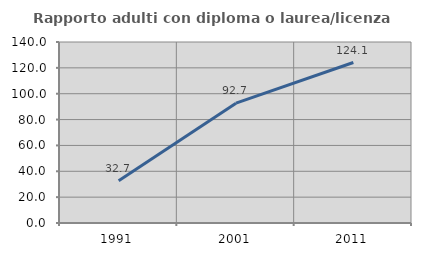
| Category | Rapporto adulti con diploma o laurea/licenza media  |
|---|---|
| 1991.0 | 32.653 |
| 2001.0 | 92.683 |
| 2011.0 | 124.113 |